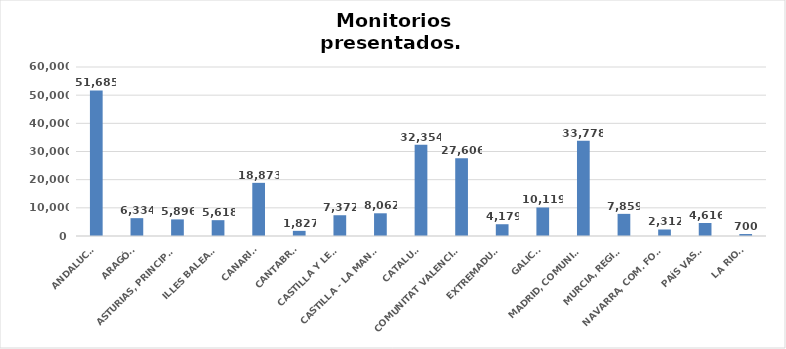
| Category | Series 0 |
|---|---|
| ANDALUCÍA | 51685 |
| ARAGÓN | 6334 |
| ASTURIAS, PRINCIPADO | 5896 |
| ILLES BALEARS | 5618 |
| CANARIAS | 18873 |
| CANTABRIA | 1827 |
| CASTILLA Y LEÓN | 7372 |
| CASTILLA - LA MANCHA | 8062 |
| CATALUÑA | 32354 |
| COMUNITAT VALENCIANA | 27606 |
| EXTREMADURA | 4179 |
| GALICIA | 10119 |
| MADRID, COMUNIDAD | 33778 |
| MURCIA, REGIÓN | 7859 |
| NAVARRA, COM. FORAL | 2312 |
| PAÍS VASCO | 4616 |
| LA RIOJA | 700 |